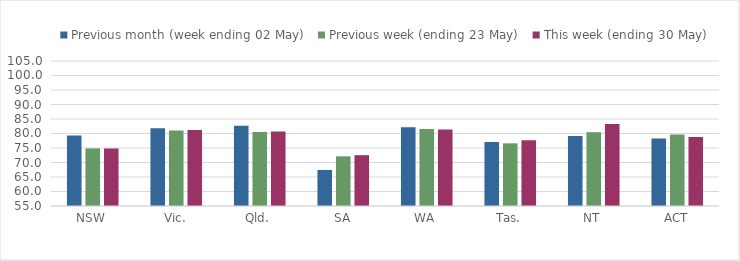
| Category | Previous month (week ending 02 May) | Previous week (ending 23 May) | This week (ending 30 May) |
|---|---|---|---|
| NSW | 79.342 | 74.867 | 74.838 |
| Vic. | 81.842 | 81.052 | 81.189 |
| Qld. | 82.694 | 80.51 | 80.668 |
| SA | 67.436 | 72.14 | 72.524 |
| WA | 82.118 | 81.587 | 81.383 |
| Tas. | 77.079 | 76.606 | 77.655 |
| NT | 79.108 | 80.426 | 83.276 |
| ACT | 78.301 | 79.673 | 78.8 |